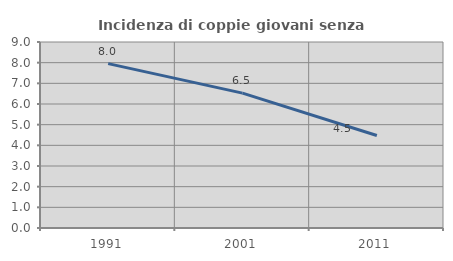
| Category | Incidenza di coppie giovani senza figli |
|---|---|
| 1991.0 | 7.954 |
| 2001.0 | 6.525 |
| 2011.0 | 4.475 |